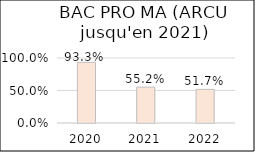
| Category | BAC PRO MA 
(ARCU jusqu'à 2021) |
|---|---|
| 2020.0 | 0.933 |
| 2021.0 | 0.552 |
| 2022.0 | 0.517 |